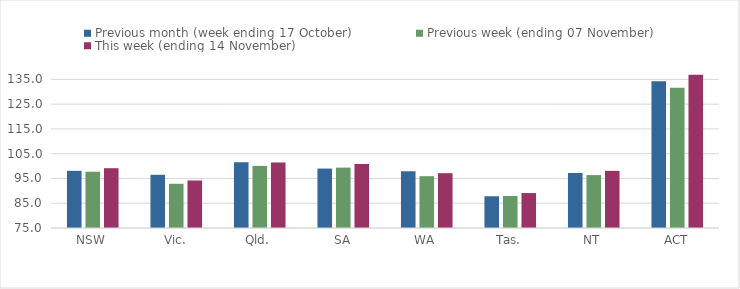
| Category | Previous month (week ending 17 October) | Previous week (ending 07 November) | This week (ending 14 November) |
|---|---|---|---|
| NSW | 98.08 | 97.72 | 99.14 |
| Vic. | 96.48 | 92.85 | 94.18 |
| Qld. | 101.58 | 100.07 | 101.46 |
| SA | 98.99 | 99.38 | 100.86 |
| WA | 97.91 | 95.92 | 97.13 |
| Tas. | 87.81 | 87.93 | 89.11 |
| NT | 97.22 | 96.36 | 98.07 |
| ACT | 134.21 | 131.58 | 136.89 |